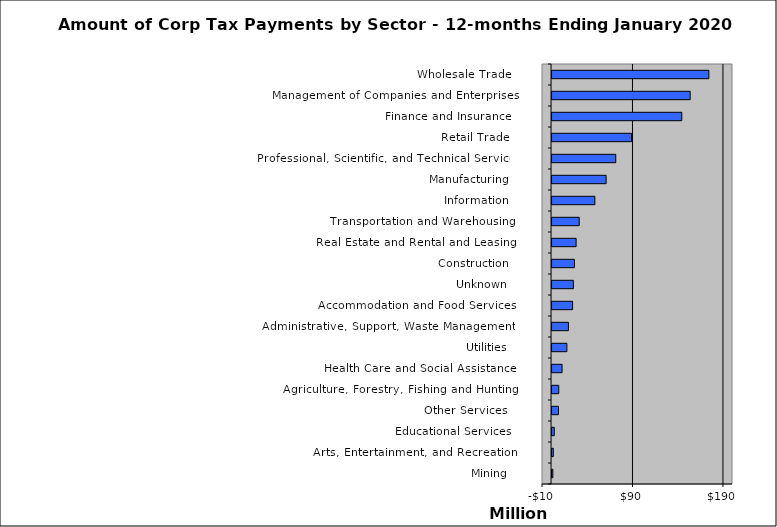
| Category | Payment |
|---|---|
| Mining | 880000 |
| Arts, Entertainment, and Recreation | 1388000 |
| Educational Services | 2451000 |
| Other Services  | 7100000 |
| Agriculture, Forestry, Fishing and Hunting | 7394000 |
| Health Care and Social Assistance | 11077000 |
| Utilities | 16390000 |
| Administrative, Support, Waste Management, | 18111000 |
| Accommodation and Food Services | 22737000 |
| Unknown | 23573000 |
| Construction | 24699000 |
| Real Estate and Rental and Leasing | 26605000 |
| Transportation and Warehousing | 30022000 |
| Information | 47304000 |
| Manufacturing | 59784000 |
| Professional, Scientific, and Technical Services | 70416000 |
| Retail Trade | 87862000 |
| Finance and Insurance | 143400000 |
| Management of Companies and Enterprises | 152665000 |
| Wholesale Trade | 173313000 |